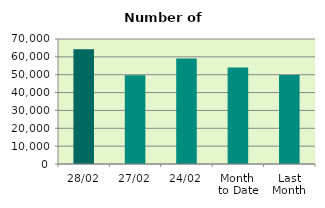
| Category | Series 0 |
|---|---|
| 28/02 | 64222 |
| 27/02 | 49712 |
| 24/02 | 59120 |
| Month 
to Date | 54034.8 |
| Last
Month | 49894.952 |